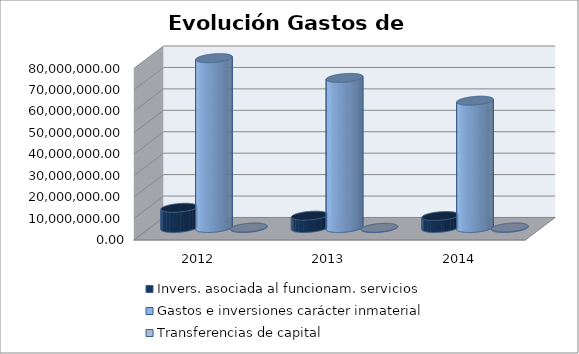
| Category | Invers. asociada al funcionam. servicios | Gastos e inversiones carácter inmaterial | Transferencias de capital |
|---|---|---|---|
| 2012.0 | 9429520.54 | 79237322.47 | 200037.96 |
| 2013.0 | 5748750.06 | 70016050.68 | 72811.4 |
| 2014.0 | 5582102.82 | 59387313.75 | 249245 |